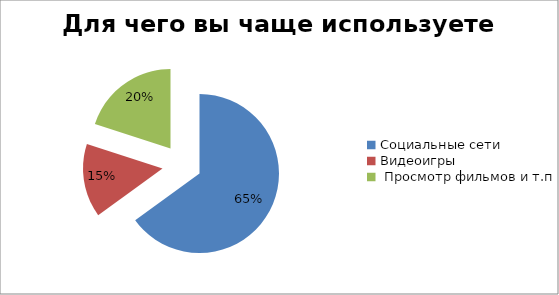
| Category | Series 0 |
|---|---|
| Социальные сети | 13 |
| Видеоигры | 3 |
|  Просмотр фильмов и т.п | 4 |